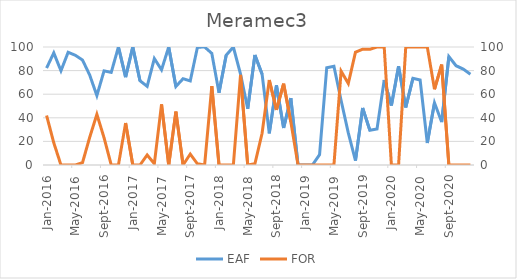
| Category | EAF |
|---|---|
| 2016-01-01 | 82.15 |
| 2016-02-01 | 95.02 |
| 2016-03-01 | 79.85 |
| 2016-04-01 | 95.53 |
| 2016-05-01 | 92.98 |
| 2016-06-01 | 88.96 |
| 2016-07-01 | 76.23 |
| 2016-08-01 | 58.83 |
| 2016-09-01 | 79.76 |
| 2016-10-01 | 78.49 |
| 2016-11-01 | 100 |
| 2016-12-01 | 74.55 |
| 2017-01-01 | 100 |
| 2017-02-01 | 71.43 |
| 2017-03-01 | 66.66 |
| 2017-04-01 | 90.22 |
| 2017-05-01 | 80.65 |
| 2017-06-01 | 100 |
| 2017-07-01 | 66.54 |
| 2017-08-01 | 73.13 |
| 2017-09-01 | 71.26 |
| 2017-10-01 | 99.78 |
| 2017-11-01 | 100 |
| 2017-12-01 | 94.59 |
| 2018-01-01 | 61.16 |
| 2018-02-01 | 93.01 |
| 2018-03-01 | 100 |
| 2018-04-01 | 76.96 |
| 2018-05-01 | 47.63 |
| 2018-06-01 | 93.18 |
| 2018-07-01 | 76.99 |
| 2018-08-01 | 26.8 |
| 2018-09-01 | 67.48 |
| 2018-10-01 | 31.44 |
| 2018-11-01 | 56.66 |
| 2018-12-01 | 0 |
| 2019-01-01 | 0 |
| 2019-02-01 | 0 |
| 2019-03-01 | 8.75 |
| 2019-04-01 | 82.44 |
| 2019-05-01 | 83.71 |
| 2019-06-01 | 54.61 |
| 2019-07-01 | 27.18 |
| 2019-08-01 | 3.72 |
| 2019-09-01 | 48.3 |
| 2019-10-01 | 29.41 |
| 2019-11-01 | 30.54 |
| 2019-12-01 | 72.05 |
| 2020-01-01 | 50.42 |
| 2020-02-01 | 83.69 |
| 2020-03-01 | 48.82 |
| 2020-04-01 | 73.45 |
| 2020-05-01 | 72.07 |
| 2020-06-01 | 18.66 |
| 2020-07-01 | 52.69 |
| 2020-08-01 | 36.38 |
| 2020-09-01 | 91.82 |
| 2020-10-01 | 84.17 |
| 2020-11-01 | 81.25 |
| 2020-12-01 | 76.93 |